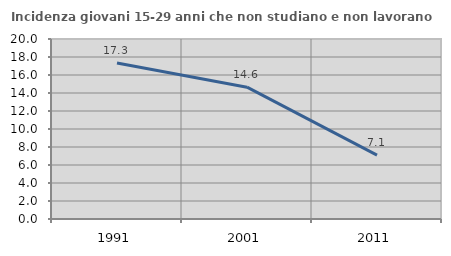
| Category | Incidenza giovani 15-29 anni che non studiano e non lavorano  |
|---|---|
| 1991.0 | 17.34 |
| 2001.0 | 14.646 |
| 2011.0 | 7.101 |